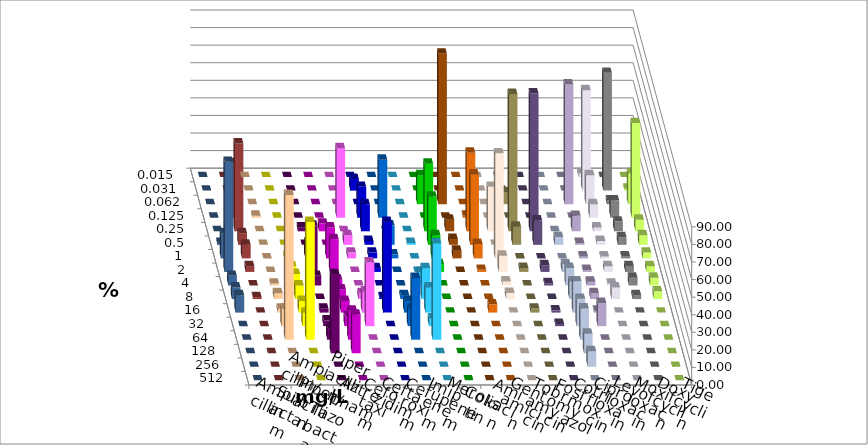
| Category | Ampicillin | Ampicillin/ Sulbactam | Piperacillin | Piperacillin/ Tazobactam | Aztreonam | Cefotaxim | Ceftazidim | Cefuroxim | Imipenem | Meropenem | Colistin | Amikacin | Gentamicin | Tobramycin | Fosfomycin | Cotrimoxazol | Ciprofloxacin | Levofloxacin | Moxifloxacin | Doxycyclin | Tigecyclin |
|---|---|---|---|---|---|---|---|---|---|---|---|---|---|---|---|---|---|---|---|---|---|
| 0.015 | 0 | 0 | 0 | 0 | 0 | 0 | 0 | 0 | 0 | 0 | 0 | 0 | 0 | 0 | 0 | 0 | 2.198 | 0 | 0 | 0 | 0 |
| 0.031 | 0 | 0 | 0 | 0 | 0 | 6.593 | 0 | 0 | 0 | 0 | 0 | 0 | 0 | 0 | 0 | 0 | 57.143 | 67.033 | 1.099 | 0 | 0 |
| 0.062 | 0 | 0 | 0 | 0 | 0 | 0 | 0 | 0 | 16.484 | 85.714 | 0 | 0 | 6.897 | 0 | 0 | 68.132 | 16.484 | 2.198 | 17.582 | 0 | 0 |
| 0.125 | 1.099 | 0 | 0 | 0 | 39.56 | 17.582 | 32.967 | 0 | 0 | 0 | 1.176 | 0 | 0 | 0 | 0 | 0 | 7.692 | 9.89 | 53.846 | 0 | 31.111 |
| 0.25 | 0 | 0 | 2.198 | 4.396 | 0 | 15.385 | 0 | 0 | 38.462 | 6.593 | 44.706 | 25.287 | 78.161 | 78.481 | 0 | 8.791 | 2.198 | 5.495 | 6.593 | 0 | 50 |
| 0.5 | 0 | 0 | 0 | 0 | 5.495 | 2.198 | 10.989 | 1.099 | 27.473 | 3.297 | 40 | 0 | 10.345 | 13.924 | 4.444 | 1.099 | 2.198 | 4.396 | 5.495 | 1.099 | 6.667 |
| 1.0 | 0 | 1.099 | 8.791 | 17.582 | 3.297 | 3.297 | 2.198 | 0 | 13.187 | 4.396 | 8.235 | 59.77 | 0 | 0 | 0 | 1.099 | 1.099 | 1.099 | 3.297 | 14.286 | 7.778 |
| 2.0 | 0 | 3.297 | 26.374 | 18.681 | 0 | 2.198 | 0 | 0 | 4.396 | 0 | 1.176 | 9.195 | 2.299 | 3.797 | 4.444 | 1.099 | 3.297 | 3.297 | 3.297 | 62.637 | 3.333 |
| 4.0 | 1.099 | 6.593 | 5.495 | 3.297 | 0 | 0 | 0 | 7.692 | 0 | 0 | 0 | 2.299 | 0 | 1.266 | 10 | 2.198 | 1.099 | 4.396 | 4.396 | 5.495 | 0 |
| 8.0 | 3.297 | 7.692 | 0 | 5.495 | 3.297 | 1.099 | 2.198 | 17.582 | 0 | 0 | 0 | 3.448 | 0 | 0 | 10 | 3.297 | 6.593 | 2.198 | 4.396 | 6.593 | 1.111 |
| 16.0 | 2.198 | 6.593 | 2.198 | 6.593 | 12.088 | 51.648 | 6.593 | 14.286 | 0 | 0 | 4.706 | 0 | 2.299 | 1.266 | 17.778 | 1.099 | 0 | 0 | 0 | 9.89 | 0 |
| 32.0 | 9.89 | 7.692 | 3.297 | 5.495 | 36.264 | 0 | 9.89 | 4.396 | 0 | 0 | 0 | 0 | 0 | 1.266 | 15.556 | 13.187 | 0 | 0 | 0 | 0 | 0 |
| 64.0 | 82.418 | 67.033 | 6.593 | 16.484 | 0 | 0 | 35.165 | 54.945 | 0 | 0 | 0 | 0 | 0 | 0 | 17.778 | 0 | 0 | 0 | 0 | 0 | 0 |
| 128.0 | 0 | 0 | 45.055 | 21.978 | 0 | 0 | 0 | 0 | 0 | 0 | 0 | 0 | 0 | 0 | 11.111 | 0 | 0 | 0 | 0 | 0 | 0 |
| 256.0 | 0 | 0 | 0 | 0 | 0 | 0 | 0 | 0 | 0 | 0 | 0 | 0 | 0 | 0 | 8.889 | 0 | 0 | 0 | 0 | 0 | 0 |
| 512.0 | 0 | 0 | 0 | 0 | 0 | 0 | 0 | 0 | 0 | 0 | 0 | 0 | 0 | 0 | 0 | 0 | 0 | 0 | 0 | 0 | 0 |